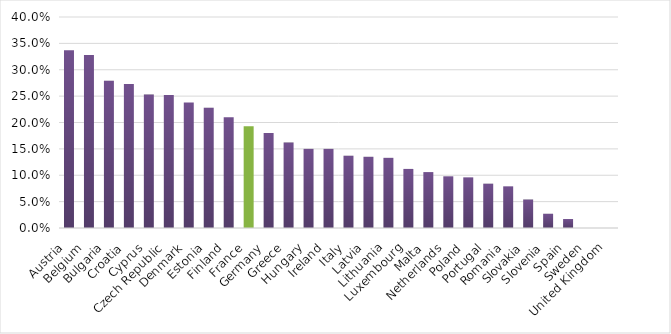
| Category | Series 0 |
|---|---|
| Austria | 0.337 |
| Belgium | 0.328 |
| Bulgaria | 0.279 |
| Croatia | 0.273 |
| Cyprus | 0.253 |
| Czech Republic | 0.252 |
| Denmark | 0.238 |
| Estonia | 0.228 |
| Finland | 0.21 |
| France | 0.193 |
| Germany | 0.18 |
| Greece | 0.162 |
| Hungary | 0.15 |
| Ireland | 0.15 |
| Italy | 0.137 |
| Latvia | 0.135 |
| Lithuania | 0.133 |
| Luxembourg | 0.112 |
| Malta | 0.106 |
| Netherlands | 0.098 |
| Poland | 0.096 |
| Portugal | 0.084 |
| Romania | 0.079 |
| Slovakia | 0.054 |
| Slovenia | 0.027 |
| Spain | 0.017 |
| Sweden | 0 |
| United Kingdom | 0 |